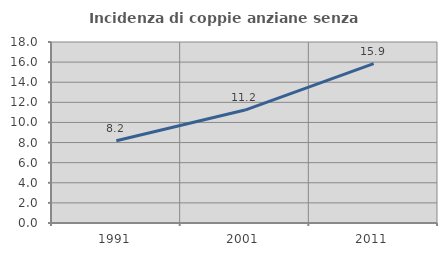
| Category | Incidenza di coppie anziane senza figli  |
|---|---|
| 1991.0 | 8.179 |
| 2001.0 | 11.23 |
| 2011.0 | 15.855 |